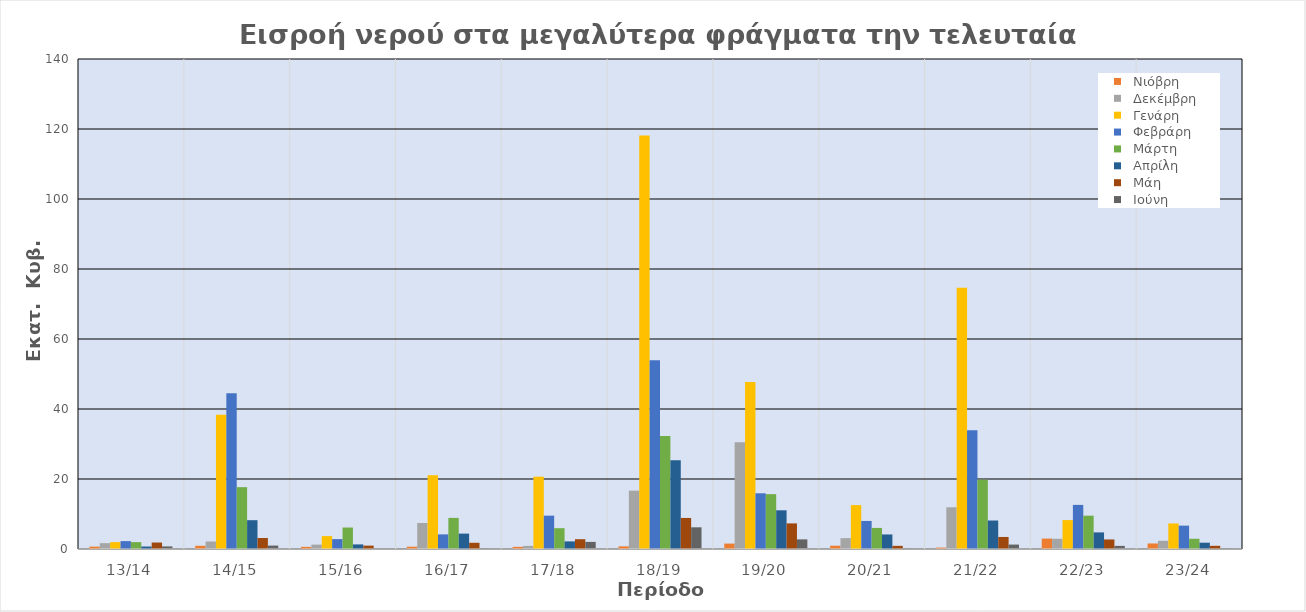
| Category |    Νιόβρη  |    Δεκέμβρη  |    Γενάρη  |    Φεβράρη  |    Μάρτη  |    Απρίλη  |    Μάη  |    Ιούνη  |
|---|---|---|---|---|---|---|---|---|
| 13/14 | 0.672 | 1.669 | 1.963 | 2.251 | 1.964 | 0.712 | 1.853 | 0.741 |
| 14/15 | 0.915 | 2.14 | 38.354 | 44.515 | 17.669 | 8.233 | 3.137 | 0.976 |
| 15/16 | 0.608 | 1.248 | 3.685 | 2.824 | 6.132 | 1.314 | 0.961 | 0.105 |
| 16/17 | 0.657 | 7.424 | 21.083 | 4.181 | 8.891 | 4.398 | 1.78 | 0.228 |
| 17/18 | 0.614 | 0.881 | 20.661 | 9.528 | 5.944 | 2.176 | 2.802 | 2.022 |
| 18/19 | 0.757 | 16.665 | 118.11 | 53.909 | 32.283 | 25.326 | 8.869 | 6.199 |
| 19/20 | 1.545 | 30.495 | 47.74 | 15.916 | 15.67 | 11.062 | 7.317 | 2.747 |
| 20/21 | 0.942 | 3.107 | 12.54 | 8.016 | 6.022 | 4.156 | 0.899 | 0.192 |
| 21/22 | 0.397 | 11.923 | 74.614 | 33.963 | 19.801 | 8.139 | 3.44 | 1.264 |
| 22/23 | 2.976 | 2.922 | 8.268 | 12.603 | 9.517 | 4.741 | 2.728 | 0.891 |
| 23/24 | 1.581 | 2.34 | 7.3 | 6.676 | 2.92 | 1.801 | 0.91 | 0.269 |